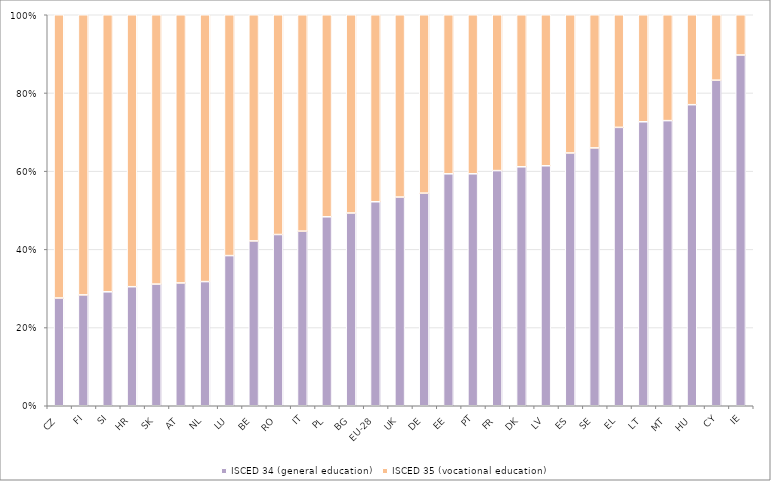
| Category | ISCED 34 (general education) | ISCED 35 (vocational education) |
|---|---|---|
| CZ | 27.558 | 72.442 |
| FI | 28.354 | 71.646 |
| SI | 29.141 | 70.859 |
| HR | 30.45 | 69.55 |
| SK | 31.117 | 68.883 |
| AT | 31.406 | 68.594 |
| NL | 31.754 | 68.246 |
| LU | 38.405 | 61.595 |
| BE | 42.157 | 57.843 |
| RO | 43.795 | 56.205 |
| IT | 44.66 | 55.34 |
| PL | 48.329 | 51.671 |
| BG | 49.298 | 50.702 |
| EU-28 | 52.176 | 47.824 |
| UK | 53.38 | 46.62 |
| DE | 54.374 | 45.626 |
| EE | 59.32 | 40.68 |
| PT | 59.324 | 40.676 |
| FR | 60.146 | 39.854 |
| DK | 61.114 | 38.886 |
| LV | 61.376 | 38.624 |
| ES | 64.651 | 35.349 |
| SE | 65.946 | 34.054 |
| EL | 71.196 | 28.804 |
| LT | 72.629 | 27.371 |
| MT | 72.925 | 27.075 |
| HU | 76.999 | 23.001 |
| CY | 83.268 | 16.732 |
| IE | 89.707 | 10.293 |